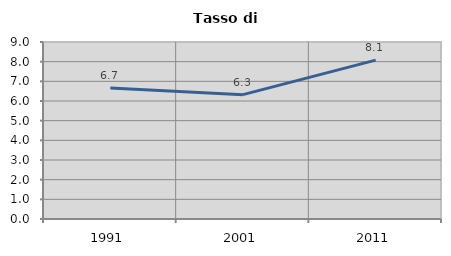
| Category | Tasso di disoccupazione   |
|---|---|
| 1991.0 | 6.667 |
| 2001.0 | 6.322 |
| 2011.0 | 8.076 |